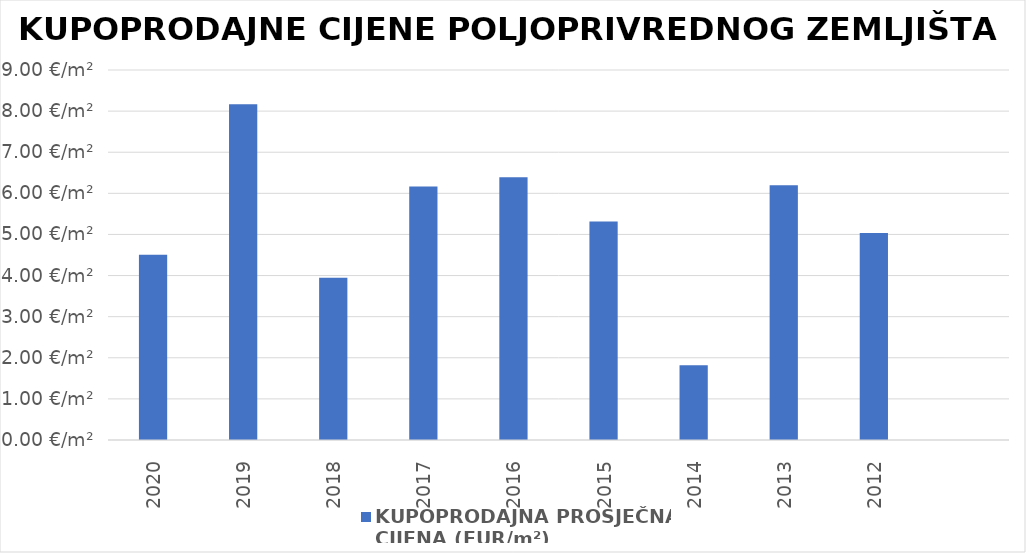
| Category | KUPOPRODAJNA PROSJEČNA 
CIJENA (EUR/m²) |
|---|---|
| 2020 | 1900-01-04 12:12:22 |
| 2019 | 1900-01-08 04:02:42 |
| 2018 | 1900-01-03 22:40:35 |
| 2017 | 1900-01-06 04:00:30 |
| 2016 | 1900-01-06 09:26:49 |
| 2015 | 1900-01-05 07:31:11 |
| 2014 | 1900-01-01 19:37:38 |
| 2013 | 1900-01-06 04:43:54 |
| 2012 | 1900-01-05 00:46:20 |